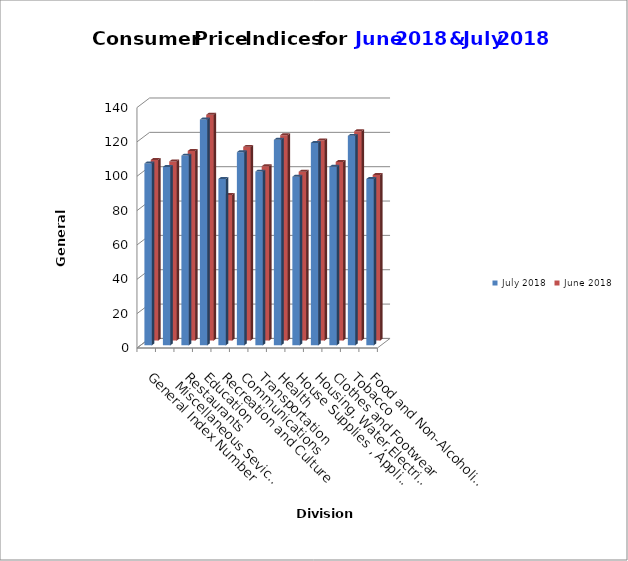
| Category |               July 2018 |              June 2018 |
|---|---|---|
| Food and Non-Alcoholic Beverages | 96.9 | 96.4 |
| Tobacco | 122 | 121.9 |
| Clothes and Footwear | 104 | 104 |
| Housing, Water,Electricity & LPG  | 117.9 | 116.6 |
| House Supplies , Appliances & Maintenance | 98.2 | 98.3 |
| Health | 119.7 | 119.6 |
| Transportation | 101.2 | 101.5 |
| Communications | 112.5 | 112.8 |
| Recreation and Culture | 96.9 | 84.8 |
| Education | 131.5 | 131.5 |
| Restaurants | 110.5 | 110.4 |
|    Miscellaneous Sevices and Goods | 103.9 | 104.3 |
| General Index Number | 105.9 | 105.2 |